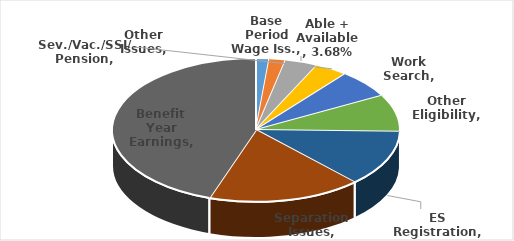
| Category | Series 0 |
|---|---|
| Base Period Wage Iss. | 0.015 |
| Other Issues | 0.018 |
| Able + Available | 0.037 |
| Sev./Vac./SSI/ Pension | 0.037 |
| Work Search | 0.064 |
| Other Eligibility | 0.083 |
| ES Registration | 0.126 |
| Separation Issues | 0.172 |
| Benefit Year Earnings | 0.448 |